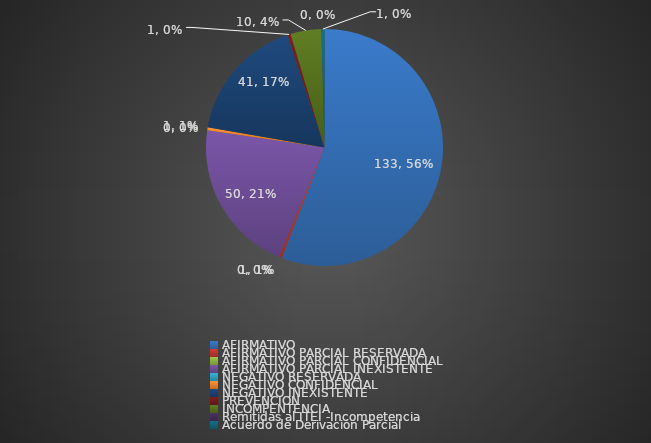
| Category | Series 0 |
|---|---|
| AFIRMATIVO | 133 |
| AFIRMATIVO PARCIAL RESERVADA | 1 |
| AFIRMATIVO PARCIAL CONFIDENCIAL | 0 |
| AFIRMATIVO PARCIAL INEXISTENTE | 50 |
| NEGATIVO RESERVADA | 0 |
| NEGATIVO CONFIDENCIAL | 1 |
| NEGATIVO INEXISTENTE | 41 |
| PREVENCION | 1 |
| INCOMPENTENCIA | 10 |
| Remitidas al ITEI -Incompetencia  | 0 |
| Acuerdo de Derivación Parcial | 1 |